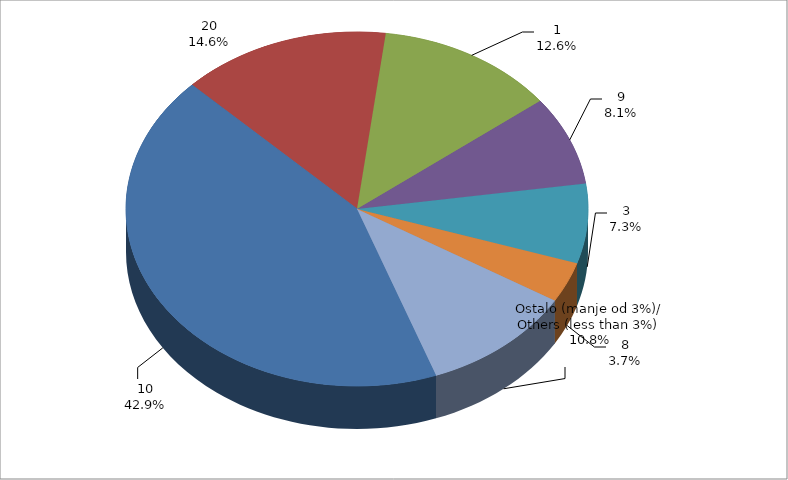
| Category | Series 0 | Series 1 |
|---|---|---|
| 10 | 34080088.765 | 0.429 |
| 20 | 11635553.833 | 0.146 |
| 1 | 9979889.17 | 0.126 |
| 9 | 6470867.276 | 0.081 |
| 3 | 5783545.775 | 0.073 |
| 8 | 2931995.847 | 0.037 |
| Ostalo (manje od 3%)/
Others (less than 3%) | 8564731.345 | 0.108 |